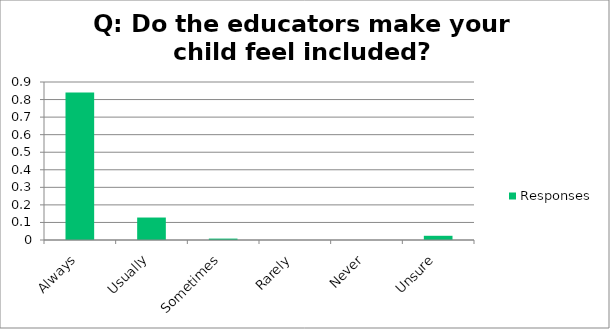
| Category | Responses |
|---|---|
| Always | 0.84 |
| Usually | 0.128 |
| Sometimes | 0.008 |
| Rarely | 0 |
| Never | 0 |
| Unsure | 0.024 |